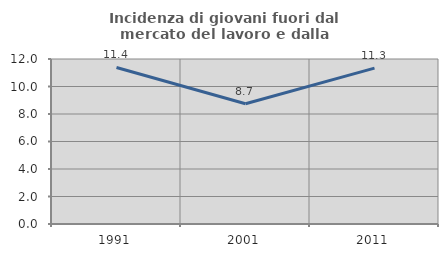
| Category | Incidenza di giovani fuori dal mercato del lavoro e dalla formazione  |
|---|---|
| 1991.0 | 11.382 |
| 2001.0 | 8.749 |
| 2011.0 | 11.333 |